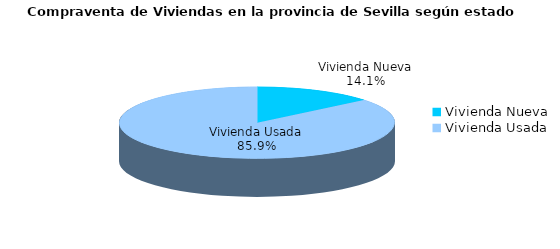
| Category | Series 0 | Series 1 |
|---|---|---|
| Vivienda Nueva | 133 | 0.141 |
| Vivienda Usada | 812 | 0.859 |